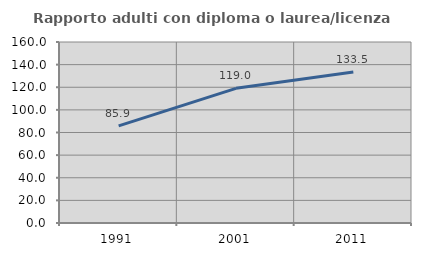
| Category | Rapporto adulti con diploma o laurea/licenza media  |
|---|---|
| 1991.0 | 85.897 |
| 2001.0 | 119.03 |
| 2011.0 | 133.462 |